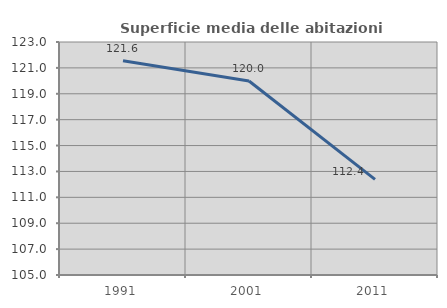
| Category | Superficie media delle abitazioni occupate |
|---|---|
| 1991.0 | 121.558 |
| 2001.0 | 119.991 |
| 2011.0 | 112.392 |